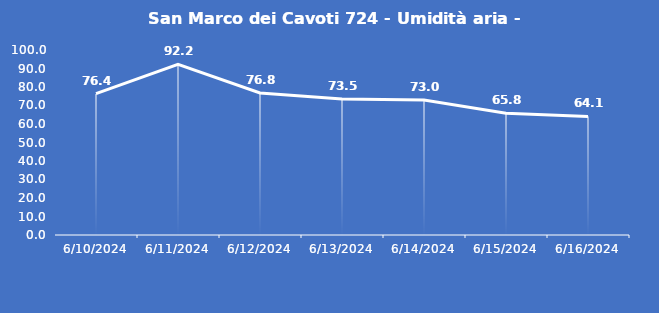
| Category | San Marco dei Cavoti 724 - Umidità aria - Grezzo (%) |
|---|---|
| 6/10/24 | 76.4 |
| 6/11/24 | 92.2 |
| 6/12/24 | 76.8 |
| 6/13/24 | 73.5 |
| 6/14/24 | 73 |
| 6/15/24 | 65.8 |
| 6/16/24 | 64.1 |